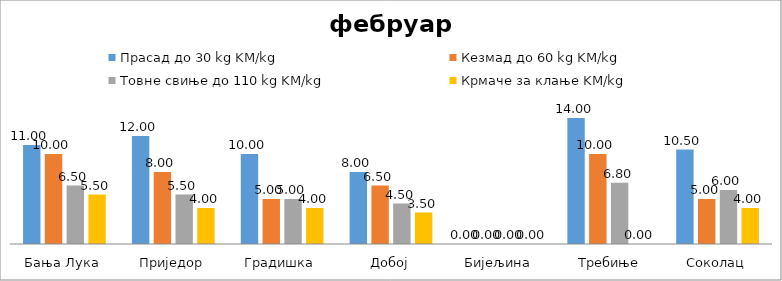
| Category | Прасад до 30 kg | Кезмад до 60 kg | Товне свиње до 110 kg | Крмаче за клање |
|---|---|---|---|---|
| Бања Лука | 11 | 10 | 6.5 | 5.5 |
| Приједор | 12 | 8 | 5.5 | 4 |
| Градишка | 10 | 5 | 5 | 4 |
| Добој | 8 | 6.5 | 4.5 | 3.5 |
| Бијељина | 0 | 0 | 0 | 0 |
|  Требиње | 14 | 10 | 6.8 | 0 |
| Соколац | 10.5 | 5 | 6 | 4 |